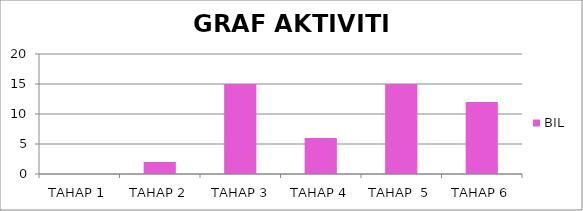
| Category | BIL |
|---|---|
| TAHAP 1 | 0 |
| TAHAP 2 | 2 |
|  TAHAP 3 | 15 |
| TAHAP 4 | 6 |
| TAHAP  5 | 15 |
| TAHAP 6 | 12 |